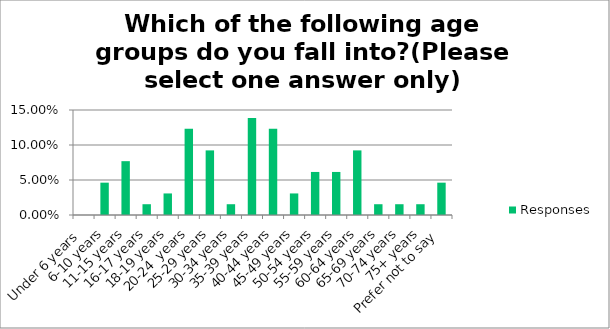
| Category | Responses |
|---|---|
| Under 6 years | 0 |
| 6-10 years | 0.046 |
| 11-15 years | 0.077 |
| 16-17 years | 0.015 |
| 18-19 years | 0.031 |
| 20-24  years | 0.123 |
| 25-29 years | 0.092 |
| 30-34 years | 0.015 |
| 35-39 years | 0.138 |
| 40-44 years | 0.123 |
| 45-49 years | 0.031 |
| 50-54 years | 0.062 |
| 55-59 years | 0.062 |
| 60-64 years | 0.092 |
| 65-69 years | 0.015 |
| 70-74 years | 0.015 |
| 75+ years | 0.015 |
| Prefer not to say | 0.046 |